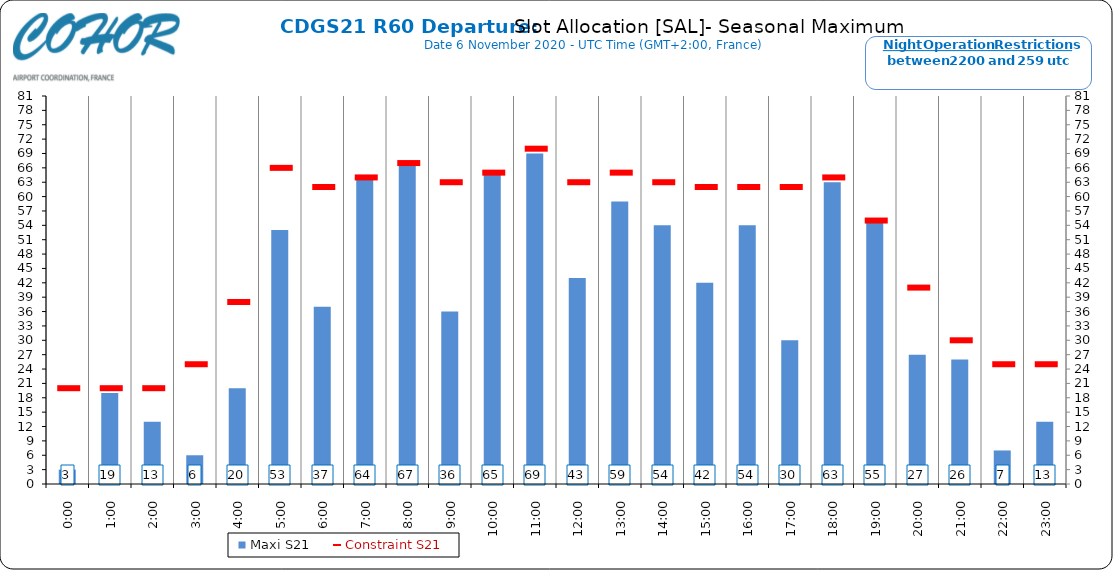
| Category | Maxi S21 |
|---|---|
| 0:00 | 3 |
| 1:00 | 19 |
| 2:00 | 13 |
| 3:00 | 6 |
| 4:00 | 20 |
| 5:00 | 53 |
| 6:00 | 37 |
| 7:00 | 64 |
| 8:00 | 67 |
| 9:00 | 36 |
| 10:00 | 65 |
| 11:00 | 69 |
| 12:00 | 43 |
| 13:00 | 59 |
| 14:00 | 54 |
| 15:00 | 42 |
| 16:00 | 54 |
| 17:00 | 30 |
| 18:00 | 63 |
| 19:00 | 55 |
| 20:00 | 27 |
| 21:00 | 26 |
| 22:00 | 7 |
| 23:00 | 13 |